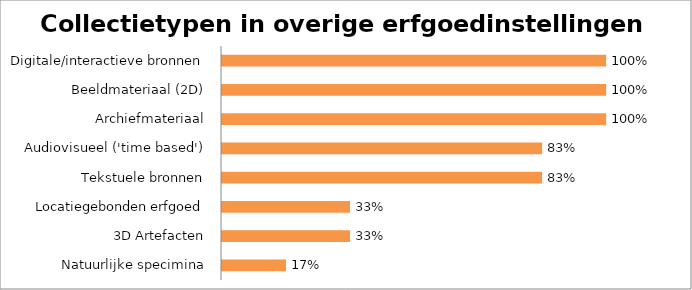
| Category | Overig (n=6) |
|---|---|
| Natuurlijke specimina | 0.167 |
| 3D Artefacten | 0.333 |
| Locatiegebonden erfgoed | 0.333 |
| Tekstuele bronnen | 0.833 |
| Audiovisueel ('time based') | 0.833 |
| Archiefmateriaal | 1 |
| Beeldmateriaal (2D) | 1 |
| Digitale/interactieve bronnen | 1 |